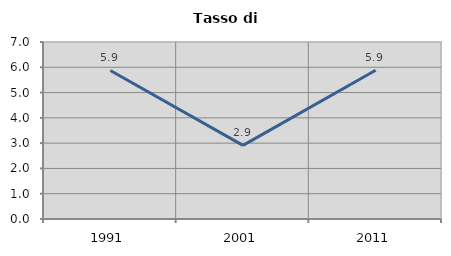
| Category | Tasso di disoccupazione   |
|---|---|
| 1991.0 | 5.873 |
| 2001.0 | 2.913 |
| 2011.0 | 5.882 |